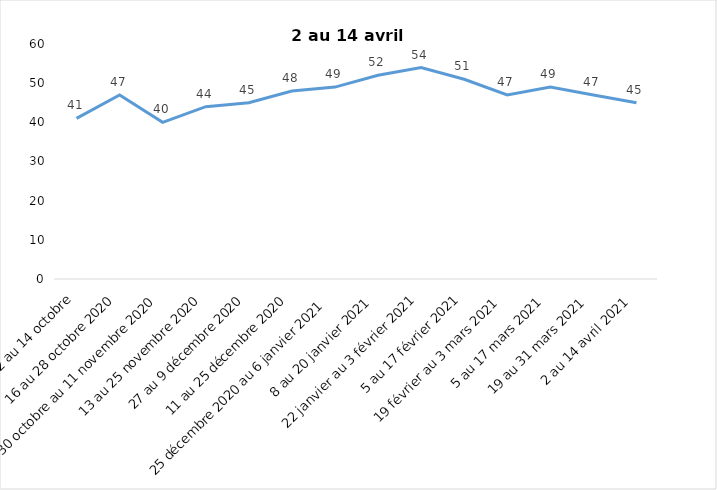
| Category | Toujours aux trois mesures |
|---|---|
| 2 au 14 octobre | 41 |
| 16 au 28 octobre 2020 | 47 |
| 30 octobre au 11 novembre 2020 | 40 |
| 13 au 25 novembre 2020 | 44 |
| 27 au 9 décembre 2020 | 45 |
| 11 au 25 décembre 2020 | 48 |
| 25 décembre 2020 au 6 janvier 2021 | 49 |
| 8 au 20 janvier 2021 | 52 |
| 22 janvier au 3 février 2021 | 54 |
| 5 au 17 février 2021 | 51 |
| 19 février au 3 mars 2021 | 47 |
| 5 au 17 mars 2021 | 49 |
| 19 au 31 mars 2021 | 47 |
| 2 au 14 avril 2021 | 45 |